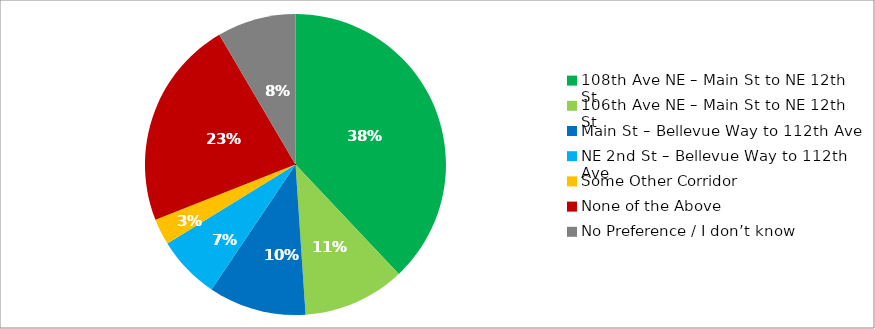
| Category | Responses |
|---|---|
| 108th Ave NE – Main St to NE 12th St | 0.38 |
| 106th Ave NE – Main St to NE 12th St | 0.11 |
| Main St – Bellevue Way to 112th Ave | 0.105 |
| NE 2nd St – Bellevue Way to 112th Ave | 0.068 |
| Some Other Corridor | 0.028 |
| None of the Above | 0.225 |
| No Preference / I don’t know | 0.084 |